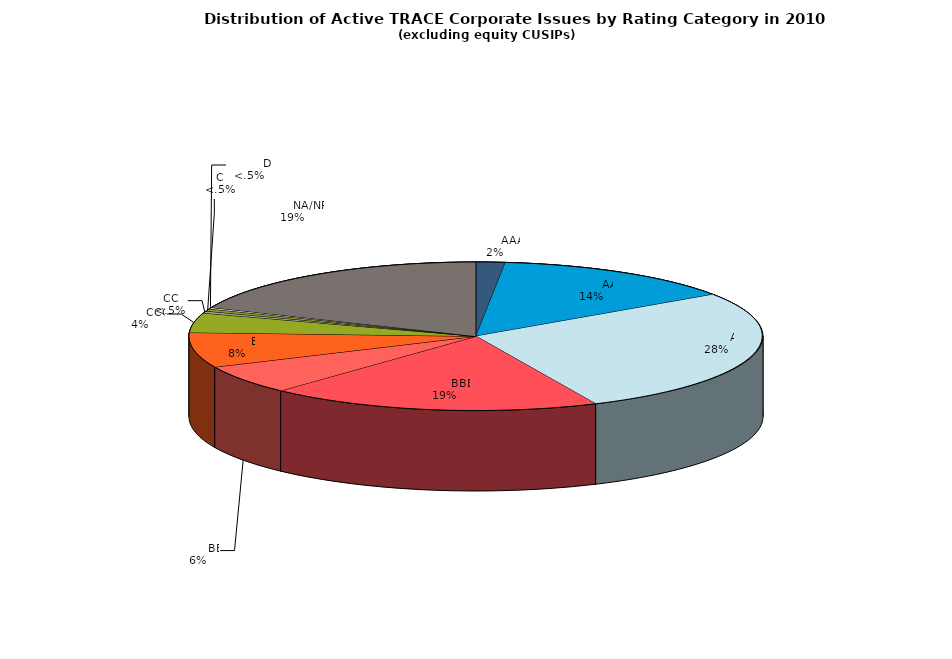
| Category | Series 0 |
|---|---|
|         AAA | 447 |
|         AA | 3792 |
|         A | 7573 |
|         BBB | 5133 |
|         BB | 1722 |
|         B | 2086 |
|         CCC | 1162 |
|         CC | 121 |
|         C | 142 |
|         D | 82 |
|         NA/NR | 5108 |